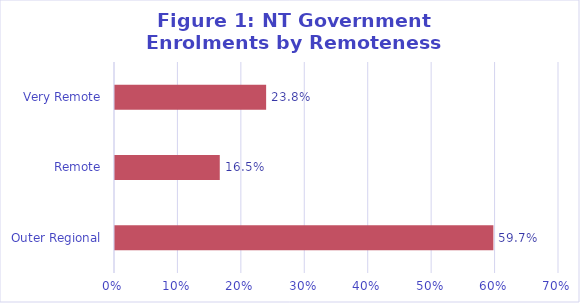
| Category | Series 0 |
|---|---|
| Outer Regional | 0.597 |
| Remote | 0.165 |
| Very Remote | 0.238 |